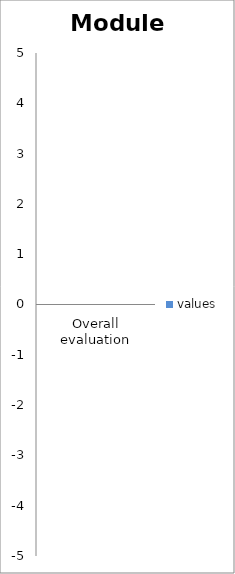
| Category | values |
|---|---|
| Overall evaluation | 0 |